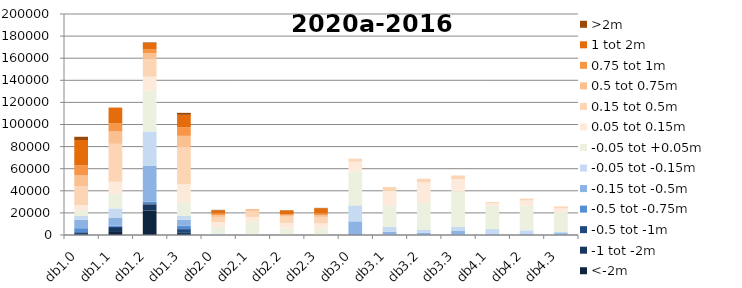
| Category | <-2m | -1 tot -2m | -0.5 tot -1m | -0.5 tot -0.75m | -0.15 tot -0.5m | -0.05 tot -0.15m | -0.05 tot +0.05m | 0.05 tot 0.15m | 0.15 tot 0.5m | 0.5 tot 0.75m | 0.75 tot 1m | 1 tot 2m | >2m |
|---|---|---|---|---|---|---|---|---|---|---|---|---|---|
| db1.0 | 0 | 669 | 1840 | 3644 | 7653 | 3441 | 4607 | 5110 | 16907 | 10100 | 9020 | 22974 | 2922 |
| db1.1 | 2748 | 3590 | 977 | 1174 | 7329 | 8225 | 13181 | 10971 | 34335 | 11181 | 7587 | 13977 | 44 |
| db1.2 | 22044 | 5510 | 1123 | 1544 | 32596 | 30893 | 37176 | 12417 | 16474 | 4809 | 3712 | 5553 | 468 |
| db1.3 | 0 | 2522 | 2803 | 3260 | 5183 | 3676 | 12240 | 16207 | 33258 | 10591 | 7878 | 11119 | 1809 |
| db2.0 | 20 | 63 | 34 | 55 | 325 | 630 | 6000 | 4564 | 4682 | 1586 | 1424 | 2885 | 494 |
| db2.1 | 0 | 22 | 13 | 18 | 169 | 392 | 11222 | 4553 | 5472 | 992 | 380 | 108 | 0 |
| db2.2 | 0 | 14 | 8 | 12 | 236 | 448 | 5069 | 5173 | 5674 | 1174 | 899 | 3466 | 301 |
| db2.3 | 0 | 19 | 14 | 20 | 197 | 395 | 5050 | 4796 | 5904 | 1664 | 1342 | 4787 | 363 |
| db3.0 | 73 | 161 | 111 | 376 | 11648 | 14421 | 30699 | 8908 | 2228 | 130 | 64 | 78 | 1 |
| db3.1 | 0 | 2 | 21 | 107 | 2911 | 4199 | 19173 | 13522 | 3396 | 48 | 21 | 25 | 0 |
| db3.2 | 0 | 4 | 4 | 66 | 1915 | 2573 | 24432 | 18628 | 3292 | 25 | 5 | 0 | 0 |
| db3.3 | 1 | 48 | 84 | 317 | 3593 | 3549 | 31898 | 11182 | 3121 | 85 | 25 | 17 | 0 |
| db4.1 | 0 | 6 | 8 | 15 | 1174 | 4176 | 21001 | 2529 | 915 | 17 | 0 | 2 | 0 |
| db4.2 | 1 | 30 | 37 | 46 | 1260 | 2854 | 22242 | 4850 | 1551 | 51 | 14 | 10 | 0 |
| db4.3 | 4 | 71 | 37 | 145 | 1437 | 1287 | 17860 | 3461 | 1330 | 149 | 27 | 2 | 0 |